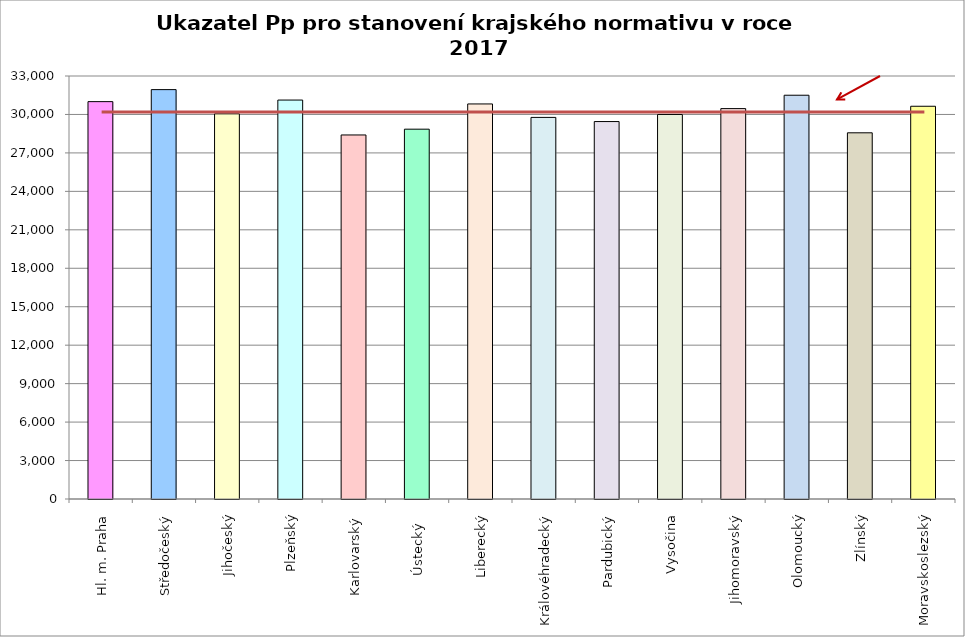
| Category | Series 0 |
|---|---|
| Hl. m. Praha | 31000 |
| Středočeský | 31938 |
| Jihočeský | 30048 |
| Plzeňský | 31123 |
| Karlovarský  | 28400 |
| Ústecký   | 28851 |
| Liberecký | 30820 |
| Královéhradecký | 29770 |
| Pardubický | 29446 |
| Vysočina | 29999 |
| Jihomoravský | 30457 |
| Olomoucký | 31500 |
| Zlínský | 28569 |
| Moravskoslezský | 30640 |